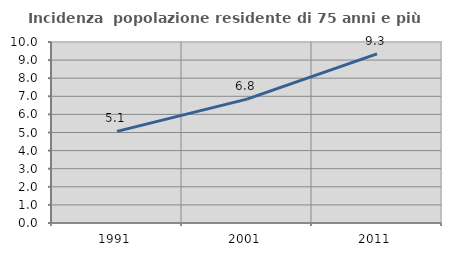
| Category | Incidenza  popolazione residente di 75 anni e più |
|---|---|
| 1991.0 | 5.06 |
| 2001.0 | 6.843 |
| 2011.0 | 9.344 |